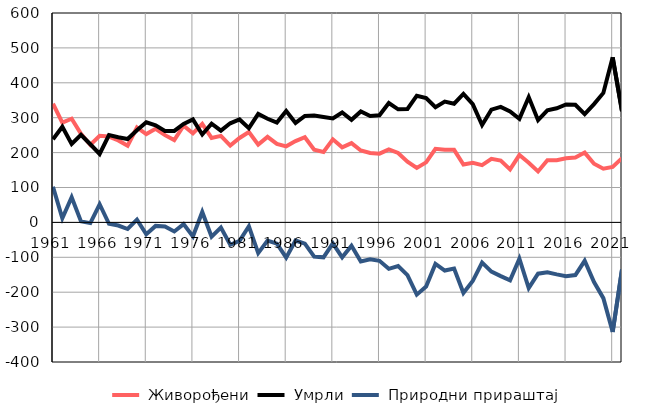
| Category |  Живорођени |  Умрли |  Природни прираштај |
|---|---|---|---|
| 1961.0 | 340 | 238 | 102 |
| 1962.0 | 286 | 274 | 12 |
| 1963.0 | 297 | 225 | 72 |
| 1964.0 | 254 | 251 | 3 |
| 1965.0 | 222 | 224 | -2 |
| 1966.0 | 248 | 196 | 52 |
| 1967.0 | 246 | 250 | -4 |
| 1968.0 | 235 | 244 | -9 |
| 1969.0 | 220 | 239 | -19 |
| 1970.0 | 272 | 264 | 8 |
| 1971.0 | 253 | 287 | -34 |
| 1972.0 | 268 | 278 | -10 |
| 1973.0 | 250 | 262 | -12 |
| 1974.0 | 236 | 262 | -26 |
| 1975.0 | 277 | 282 | -5 |
| 1976.0 | 255 | 295 | -40 |
| 1977.0 | 282 | 252 | 30 |
| 1978.0 | 242 | 283 | -41 |
| 1979.0 | 248 | 263 | -15 |
| 1980.0 | 220 | 284 | -64 |
| 1981.0 | 242 | 295 | -53 |
| 1982.0 | 259 | 270 | -11 |
| 1983.0 | 223 | 311 | -88 |
| 1984.0 | 245 | 297 | -52 |
| 1985.0 | 225 | 286 | -61 |
| 1986.0 | 218 | 319 | -101 |
| 1987.0 | 233 | 285 | -52 |
| 1988.0 | 244 | 305 | -61 |
| 1989.0 | 208 | 306 | -98 |
| 1990.0 | 202 | 302 | -100 |
| 1991.0 | 238 | 298 | -60 |
| 1992.0 | 215 | 315 | -100 |
| 1993.0 | 227 | 294 | -67 |
| 1994.0 | 206 | 318 | -112 |
| 1995.0 | 199 | 305 | -106 |
| 1996.0 | 197 | 307 | -110 |
| 1997.0 | 209 | 342 | -133 |
| 1998.0 | 199 | 324 | -125 |
| 1999.0 | 174 | 325 | -151 |
| 2000.0 | 156 | 363 | -207 |
| 2001.0 | 172 | 356 | -184 |
| 2002.0 | 211 | 330 | -119 |
| 2003.0 | 208 | 346 | -138 |
| 2004.0 | 208 | 340 | -132 |
| 2005.0 | 166 | 368 | -202 |
| 2006.0 | 171 | 339 | -168 |
| 2007.0 | 164 | 279 | -115 |
| 2008.0 | 182 | 323 | -141 |
| 2009.0 | 177 | 331 | -154 |
| 2010.0 | 152 | 318 | -166 |
| 2011.0 | 193 | 297 | -104 |
| 2012.0 | 171 | 359 | -188 |
| 2013.0 | 146 | 293 | -147 |
| 2014.0 | 178 | 321 | -143 |
| 2015.0 | 178 | 327 | -149 |
| 2016.0 | 184 | 338 | -154 |
| 2017.0 | 186 | 337 | -151 |
| 2018.0 | 200 | 310 | -110 |
| 2019.0 | 168 | 339 | -171 |
| 2020.0 | 154 | 371 | -217 |
| 2021.0 | 159 | 473 | -314 |
| 2022.0 | 184 | 319 | -135 |